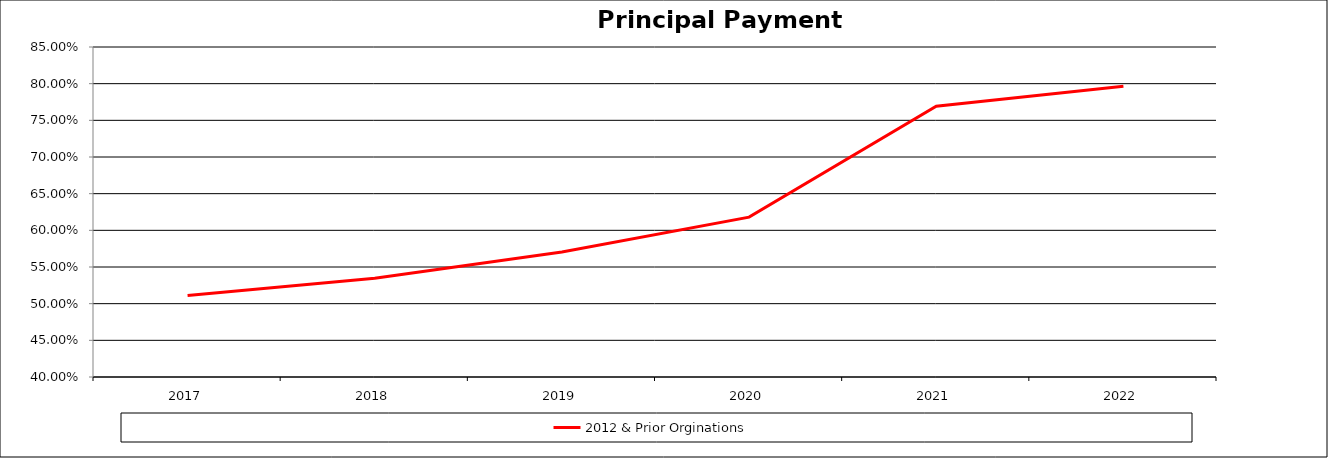
| Category | 2012 & Prior Orginations  |
|---|---|
| 2017.0 | 0.511 |
| 2018.0 | 0.535 |
| 2019.0 | 0.57 |
| 2020.0 | 0.618 |
| 2021.0 | 0.769 |
| 2022.0 | 0.797 |